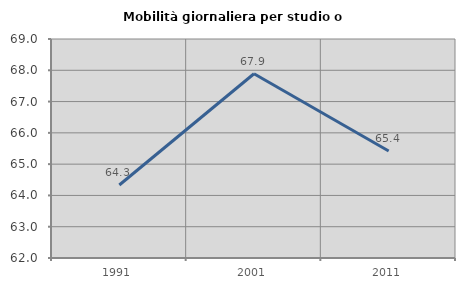
| Category | Mobilità giornaliera per studio o lavoro |
|---|---|
| 1991.0 | 64.333 |
| 2001.0 | 67.89 |
| 2011.0 | 65.421 |